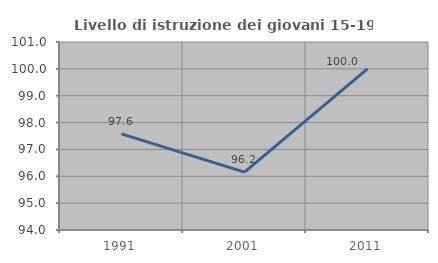
| Category | Livello di istruzione dei giovani 15-19 anni |
|---|---|
| 1991.0 | 97.581 |
| 2001.0 | 96.154 |
| 2011.0 | 100 |